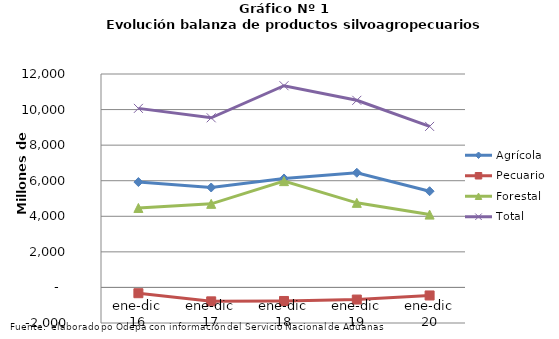
| Category | Agrícola | Pecuario | Forestal | Total |
|---|---|---|---|---|
| ene-dic 16 | 5924661 | -325421 | 4468104 | 10067344 |
| ene-dic 17 | 5619304 | -782654 | 4700192 | 9536842 |
| ene-dic 18 | 6126434 | -761998 | 5976134 | 11340570 |
| ene-dic 19 | 6446239 | -681606 | 4755358 | 10519991 |
| ene-dic 20 | 5410198 | -451397 | 4094904 | 9053705 |